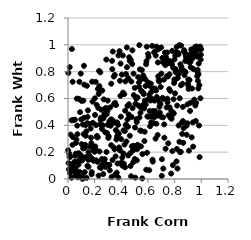
| Category | Series 0 |
|---|---|
| 0.8048160379679911 | 0.921 |
| 0.6412530690746505 | 0.416 |
| 0.036848699491668656 | 0.312 |
| 0.8508803725687043 | 0.835 |
| 0.6913978955041147 | 0.734 |
| 0.3902861109157759 | 0.213 |
| 0.5729293044220957 | 0.283 |
| 0.8110375856228726 | 0.946 |
| 0.24806886873163023 | 0.083 |
| 0.5027506385205199 | 0.384 |
| 0.44573678088368307 | 0.545 |
| 0.3434325248215889 | 0.764 |
| 0.561053336274124 | 0.55 |
| 0.24146370101987005 | 0.406 |
| 0.7851093031259042 | 0.482 |
| 0.20997103220456537 | 0.402 |
| 0.4303696479341876 | 0.727 |
| 0.10259249432398762 | 0.26 |
| 0.7798508613737885 | 0.853 |
| 0.24624403608130385 | 0.456 |
| 0.1730998822928173 | 0.308 |
| 0.8730987772841702 | 0.774 |
| 0.4771677226068377 | 0.462 |
| 0.19122029559249532 | 0.235 |
| 0.6785153978333146 | 0.967 |
| 0.03936746894879441 | 0.44 |
| 0.3206762801182168 | 0.443 |
| 0.38258311964538483 | 0.235 |
| 0.3844784113742594 | 0.225 |
| 0.3681660735472492 | 0.422 |
| 0.9689709140385898 | 0.766 |
| 0.6462743098852863 | 0.943 |
| 0.3099631757098164 | 0.105 |
| 0.8287489505397968 | 0.929 |
| 0.6857148374560557 | 0.538 |
| 0.4087598701721895 | 0.099 |
| 0.8693786946081973 | 0.95 |
| 0.8402111569531753 | 0.201 |
| 0.19983808856500268 | 0.203 |
| 0.806252504612378 | 0.819 |
| 0.29783745806520745 | 0.584 |
| 0.5157899796305667 | 0.425 |
| 0.8810528820988379 | 0.796 |
| 0.1490733598868999 | 0.511 |
| 0.4493409079521291 | 0.389 |
| 0.3490803277755809 | 0.222 |
| 0.8484357229467564 | 0.994 |
| 0.5293458375933919 | 0.547 |
| 0.4749559854918523 | 0.727 |
| 0.9367280181722548 | 0.422 |
| 0.6038354053874117 | 0.911 |
| 0.21098582234768798 | 0.214 |
| 0.12069687325942724 | 0.457 |
| 0.23005677510613035 | 0.634 |
| 0.020099144285102177 | 0.331 |
| 0.053496653326204194 | 0.174 |
| 0.14721049749832843 | 0.463 |
| 0.6044248210849298 | 0.465 |
| 0.9335570871204969 | 0.915 |
| 0.3604468680700396 | 0.551 |
| 0.643231094605576 | 0.478 |
| 0.9166533555953422 | 0.871 |
| 0.18891535484765548 | 0.228 |
| 0.37750553958991206 | 0.011 |
| 0.06481725295512407 | 0.051 |
| 0.49156706209330986 | 0.786 |
| 0.7650278276645177 | 0.876 |
| 0.7452519194500642 | 0.599 |
| 0.7916464292578508 | 0.594 |
| 0.4068009759231473 | 0.159 |
| 0.710834982930877 | 0.871 |
| 0.3133821718840352 | 0.064 |
| 0.7490497289972962 | 0.765 |
| 0.7035959168923077 | 0.023 |
| 0.3720860219728402 | 0.347 |
| 0.32833079129278914 | 0.443 |
| 0.6681677695936914 | 0.472 |
| 0.8272894318442069 | 0.779 |
| 0.04891064579619808 | 0.13 |
| 0.16629359704728555 | 0.242 |
| 0.023419354639812224 | 0.109 |
| 0.7985722187898523 | 0.891 |
| 0.16991982198271896 | 0.376 |
| 0.15444429967702467 | 0.2 |
| 0.18132061599412014 | 0.725 |
| 0.1702111666286856 | 0.151 |
| 0.9632057759010246 | 0.95 |
| 0.19315112764321993 | 0.135 |
| 0.31952743968310005 | 0.397 |
| 0.5693081703095949 | 0.538 |
| 0.004251761930587647 | 0.119 |
| 0.7430421501633343 | 0.942 |
| 0.697427239802067 | 0.464 |
| 0.9724679511926295 | 0.813 |
| 0.2173645918353844 | 0.321 |
| 0.9247368946319299 | 0.966 |
| 0.3632946576171775 | 0.295 |
| 0.5954264067940941 | 0.466 |
| 0.46419356395634676 | 0.322 |
| 0.6228622303132113 | 0.464 |
| 0.057300796040171006 | 0.084 |
| 0.4566102081277897 | 0.557 |
| 0.10893398358415206 | 0.001 |
| 0.6988001847450622 | 0.98 |
| 0.5646004305925687 | 0.772 |
| 0.33209803322518666 | 0.819 |
| 0.8081089625540443 | 0.796 |
| 0.596931256951981 | 0.592 |
| 0.3476574740772269 | 0.421 |
| 0.1397871017129596 | 0.009 |
| 0.45891351403084435 | 0.908 |
| 0.7169305897725119 | 0.597 |
| 0.9788435390067388 | 0.78 |
| 0.5787156323363809 | 0.745 |
| 0.7810713402161075 | 0.955 |
| 0.18611837737125309 | 0.419 |
| 0.05574871979741117 | 0.029 |
| 0.6547178969240556 | 0.506 |
| 0.17496583944255623 | 0.267 |
| 0.058492048325131656 | 0.189 |
| 0.2678159602451641 | 0.593 |
| 0.9384272792149398 | 0.241 |
| 0.1375155422211428 | 0.355 |
| 0.5160043820291768 | 0.139 |
| 0.695459926332687 | 0.686 |
| 0.8390021300136582 | 0.798 |
| 0.5818468911274911 | 0.693 |
| 0.9431416118818199 | 0.937 |
| 0.3654362141563176 | 0.047 |
| 0.35707544375562 | 0.169 |
| 0.7148270507419545 | 0.078 |
| 0.626209773768254 | 0.65 |
| 0.13431791821315836 | 0.164 |
| 0.9470443444692167 | 0.592 |
| 0.5500117425196831 | 0.359 |
| 0.9153122706672439 | 0.507 |
| 0.3588409693787901 | 0.364 |
| 0.5316174513720017 | 0.719 |
| 0.6642284447830702 | 0.987 |
| 0.7004161813679188 | 0.786 |
| 0.6769812162106348 | 0.765 |
| 0.3511859927170877 | 0.776 |
| 0.5750788586440214 | 0.352 |
| 0.8186558311569169 | 0.548 |
| 0.5678505033831696 | 0.633 |
| 0.2934922295686538 | 0.342 |
| 0.6314525070198469 | 0.992 |
| 0.28744572002241525 | 0.89 |
| 0.07585643305672715 | 0.119 |
| 0.32721904516621003 | 0.015 |
| 0.2792917243822691 | 0.348 |
| 0.1784138644780996 | 0.052 |
| 0.03143687584005224 | 0.104 |
| 0.576562385706362 | 0.583 |
| 0.37175541279924923 | 0.116 |
| 0.46128121574113173 | 0.471 |
| 0.8016925349532842 | 0.737 |
| 0.0025459312360142203 | 0.791 |
| 0.7255467778042767 | 0.872 |
| 0.8432535680032459 | 0.855 |
| 0.011003315112321476 | 0.166 |
| 0.7592884501775933 | 0.67 |
| 0.5193021105814963 | 0.224 |
| 0.7622489972222245 | 0.534 |
| 0.20782627532021755 | 0.724 |
| 0.07356854222332326 | 0.012 |
| 0.4187776700320601 | 0.114 |
| 0.9803273252812976 | 0.86 |
| 0.12572369945368816 | 0.052 |
| 0.9962262809924376 | 0.926 |
| 0.955091528708835 | 0.548 |
| 0.6069447748188267 | 0.597 |
| 0.5394631853148955 | 0.818 |
| 0.22332432873438213 | 0.311 |
| 0.8957698591122799 | 0.415 |
| 0.7891461199333766 | 0.828 |
| 0.0996434141433899 | 0.444 |
| 0.41515034023000635 | 0.191 |
| 0.5905139478385715 | 0.986 |
| 0.41675038389553093 | 0.363 |
| 0.773657236450272 | 0.041 |
| 0.44212130910114417 | 0.834 |
| 0.02567283399442044 | 0.009 |
| 0.7357055891118258 | 0.899 |
| 0.712584043953238 | 0.459 |
| 0.3528253194551974 | 0.568 |
| 0.12858840296570873 | 0.255 |
| 0.3243486007848635 | 0.71 |
| 0.7292748688178311 | 0.849 |
| 0.6128191903510176 | 0.507 |
| 0.2652916094593917 | 0.451 |
| 0.17699813911388584 | 0.035 |
| 0.18206875130349506 | 0.149 |
| 0.03367878854220705 | 0.254 |
| 0.20457784158936188 | 0.243 |
| 0.35437475748089486 | 0.033 |
| 0.30188381878609855 | 0.104 |
| 0.7832535737038714 | 0.208 |
| 0.8378237581727616 | 0.602 |
| 0.8878453451417957 | 0.903 |
| 0.7227709617211416 | 0.308 |
| 0.27119482135427997 | 0.135 |
| 0.6741525502740761 | 0.869 |
| 0.2846269977825291 | 0.529 |
| 0.04248283480025894 | 0.44 |
| 0.10569333759641586 | 0.138 |
| 0.3149154482639664 | 0.428 |
| 0.10613027869866468 | 0.029 |
| 0.6008738392626107 | 0.932 |
| 0.5583455519500062 | 0.186 |
| 0.019526181794592687 | 0.08 |
| 0.7319281915286389 | 0.226 |
| 0.3863287146455442 | 0.953 |
| 0.2502086209785679 | 0.517 |
| 0.5118125078379672 | 0.599 |
| 0.9359485178314961 | 0.907 |
| 0.02626952171052562 | 0.437 |
| 0.6189620236211834 | 0.585 |
| 0.32380969739468063 | 0.252 |
| 0.23548311139305195 | 0.692 |
| 0.08802271889430067 | 0.021 |
| 0.3303849235876428 | 0.88 |
| 0.5362201288249856 | 0.458 |
| 0.39445658199639444 | 0.86 |
| 0.8211185322290097 | 0.078 |
| 0.884926725820854 | 0.912 |
| 0.554770012315542 | 0.746 |
| 0.5047507612138872 | 0.01 |
| 0.8138530986290082 | 0.131 |
| 0.4936511180437289 | 0.626 |
| 0.5257141636804944 | 0.243 |
| 0.07729899798224192 | 0.136 |
| 0.22195285289826638 | 0.128 |
| 0.6611505145517063 | 0.66 |
| 0.48879040461983303 | 0.125 |
| 0.2574499699053005 | 0.659 |
| 0.15372361772268164 | 0.091 |
| 0.12216927066635556 | 0.703 |
| 0.9569947193062386 | 0.918 |
| 0.80283383021104 | 0.638 |
| 0.2272596090131578 | 0.53 |
| 0.7329941121807774 | 0.911 |
| 0.05169937658675466 | 0.443 |
| 0.2389293736291419 | 0.087 |
| 0.19409776975635853 | 0.141 |
| 0.1114741315942896 | 0.406 |
| 0.09720404005544354 | 0.176 |
| 0.40507617500263177 | 0.107 |
| 0.012877030387724989 | 0.833 |
| 0.006186548690355044 | 0.072 |
| 0.6480284451013497 | 0.584 |
| 0.49990928045378746 | 0.149 |
| 0.08582776277927397 | 0.724 |
| 0.3066266022679924 | 0.102 |
| 0.9495267015247435 | 0.568 |
| 0.6338795058866682 | 0.144 |
| 0.09564642717308515 | 0.786 |
| 0.845718230965016 | 0.202 |
| 0.8798297608187026 | 0.88 |
| 0.6104640549995154 | 0.629 |
| 0.9773982121956997 | 0.675 |
| 0.9023455612930342 | 0.742 |
| 0.2024244632717279 | 0.477 |
| 0.33630020221003804 | 0.95 |
| 0.09334830717075344 | 0.163 |
| 0.436367324262943 | 0.4 |
| 0.4037290532755966 | 0.778 |
| 0.5858075881716347 | 0.856 |
| 0.5639277297016065 | 0.643 |
| 0.7377081769587723 | 0.86 |
| 0.5701948762098781 | 0.526 |
| 0.2982828558493133 | 0.403 |
| 0.06602702955017496 | 0.599 |
| 0.7767001165413997 | 0.449 |
| 0.8540516027454408 | 0.817 |
| 0.2885757618384845 | 0.201 |
| 0.5536851859976736 | 0.813 |
| 0.8714939164513476 | 0.96 |
| 0.8169132408031525 | 0.225 |
| 0.9604627735899908 | 0.568 |
| 0.13353072803829116 | 0.321 |
| 0.16116040444494234 | 0.146 |
| 0.645677240170929 | 0.459 |
| 0.8923328184327886 | 0.899 |
| 0.2445044592955393 | 0.44 |
| 0.49742016741247386 | 0.225 |
| 0.5212950531172788 | 0.608 |
| 0.46291493973622916 | 0.881 |
| 0.22435324083276867 | 0.671 |
| 0.11328195037163839 | 0.228 |
| 0.04542772198222292 | 0.072 |
| 0.14172102281630997 | 0.695 |
| 0.8233251014317677 | 0.753 |
| 0.38136331223588515 | 0.336 |
| 0.5447603854827491 | 0.533 |
| 0.44630200163421735 | 0.444 |
| 0.6152622673486504 | 0.393 |
| 0.06954432759656205 | 0.398 |
| 0.9538337138075925 | 0.984 |
| 0.07823886163864259 | 0.107 |
| 0.29567267988940527 | 0.507 |
| 0.6209758316676542 | 0.711 |
| 0.4711321878775796 | 0.886 |
| 0.46733872729850434 | 0.193 |
| 0.04623738387279152 | 0.061 |
| 0.9185754063880479 | 0.569 |
| 0.9111752724431398 | 0.738 |
| 0.9930836196339418 | 0.602 |
| 0.90451054648089 | 0.671 |
| 0.8899003543592757 | 0.398 |
| 0.693345514646579 | 0.558 |
| 0.5431662295309747 | 0.493 |
| 0.3896380970998756 | 0.732 |
| 0.30515867955544 | 0.319 |
| 0.029177174765890736 | 0.969 |
| 0.03473832320113161 | 0.725 |
| 0.5886629924351962 | 0.878 |
| 0.835591764989214 | 0.277 |
| 0.9950032082174447 | 0.89 |
| 0.2588373860797932 | 0.108 |
| 0.060135003793550426 | 0.269 |
| 0.7463788877903434 | 0.572 |
| 0.592633580028227 | 0.196 |
| 0.3162496985230245 | 0.534 |
| 0.20126166044251567 | 0.602 |
| 0.6241956494478965 | 0.422 |
| 0.08679455388774969 | 0.053 |
| 0.9274336521782525 | 0.311 |
| 0.7091191694231516 | 0.605 |
| 0.6804002939747648 | 0.737 |
| 0.5352446029543049 | 0.997 |
| 0.982633620595707 | 0.399 |
| 0.0014173401793039727 | 0.214 |
| 0.41253459651920354 | 0.643 |
| 0.42771417932345396 | 0.087 |
| 0.3024526287686202 | 0.306 |
| 0.5869260479446795 | 0.069 |
| 0.9847453372522129 | 0.7 |
| 0.9502558711059987 | 0.942 |
| 0.48625964030769175 | 0.212 |
| 0.40118843626863987 | 0.123 |
| 0.26075685522955766 | 0.4 |
| 0.19626981598331356 | 0.209 |
| 0.8961353264265077 | 0.556 |
| 0.008951014118490511 | 0.19 |
| 0.8670603424126889 | 0.378 |
| 0.9716295100431026 | 0.797 |
| 0.4686047192664362 | 0.097 |
| 0.7047381538014715 | 0.148 |
| 0.12635470994151074 | 0.231 |
| 0.31008074148234 | 0.428 |
| 0.374935448754331 | 0.404 |
| 0.3447304075864913 | 0.558 |
| 0.27539367529782316 | 0.148 |
| 0.9126504838109599 | 0.915 |
| 0.7666258164017056 | 0.657 |
| 0.28295579248363056 | 0.111 |
| 0.508342251192858 | 0.235 |
| 0.39321054214407003 | 0.62 |
| 0.26812384855005045 | 0.462 |
| 0.48136507836854203 | 0.857 |
| 0.8472000293063932 | 0.699 |
| 0.6095097475139214 | 0.065 |
| 0.1566214265517475 | 0.149 |
| 0.7397729982779764 | 0.534 |
| 0.8538222985448833 | 0.42 |
| 0.28131536653435685 | 0.091 |
| 0.5410113143359803 | 0.361 |
| 0.16263601469403038 | 0.17 |
| 0.6719616360124111 | 0.595 |
| 0.5008025319284766 | 0.679 |
| 0.9450038752325354 | 0.917 |
| 0.7218275351179362 | 0.407 |
| 0.36753989602754356 | 0.316 |
| 0.9644264661205062 | 0.987 |
| 0.24244693615111684 | 0.795 |
| 0.4552812150957252 | 0.481 |
| 0.7934859104057508 | 0.49 |
| 0.861456895910077 | 0.537 |
| 0.23647019126137492 | 0.205 |
| 0.7708872536418231 | 0.872 |
| 0.4523679563511088 | 0.751 |
| 0.435180899166777 | 0.782 |
| 0.8562217136463667 | 0.336 |
| 0.1841013702159052 | 0.577 |
| 0.4219888138147045 | 0.632 |
| 0.9236828227154171 | 0.939 |
| 0.11961414322667153 | 0.844 |
| 0.7569432886640876 | 0.88 |
| 0.9912602430137946 | 0.987 |
| 0.8759689700202944 | 0.802 |
| 0.23329685106903708 | 0.806 |
| 0.3784666447933918 | 0.921 |
| 0.76153144905519 | 0.78 |
| 0.6887186105020155 | 0.495 |
| 0.7956687180878755 | 0.716 |
| 0.719378736267653 | 0.74 |
| 0.041499562839395265 | 0.082 |
| 0.09057465893928303 | 0.498 |
| 0.7746516469322732 | 0.508 |
| 0.7553424669311714 | 0.863 |
| 0.9665617627023164 | 0.912 |
| 0.3987209460061791 | 0.297 |
| 0.9742837852943418 | 0.732 |
| 0.4844253448565549 | 0.528 |
| 0.7269521220533531 | 0.942 |
| 0.9069609003898131 | 0.211 |
| 0.6872224141608977 | 0.568 |
| 0.5829618563947645 | 0.555 |
| 0.4335052004827897 | 0.406 |
| 0.13169487578507857 | 0.402 |
| 0.6566089395323323 | 0.301 |
| 0.2639255128353661 | 0.037 |
| 0.2765287404126788 | 0.524 |
| 0.6390117044772514 | 0.672 |
| 0.9301674912684056 | 0.674 |
| 0.5992929948883348 | 0.721 |
| 0.8153905685128157 | 0.984 |
| 0.9205150469132967 | 0.833 |
| 0.4259065800518511 | 0.357 |
| 0.8583198121879995 | 0.71 |
| 0.016319693774990665 | 0.165 |
| 0.513187397122194 | 0.445 |
| 0.6663663677588026 | 0.611 |
| 0.11756236196857932 | 0.334 |
| 0.4729816625497727 | 0.021 |
| 0.06354872401932923 | 0.293 |
| 0.7516971592958311 | 0.266 |
| 0.7074827867167729 | 0.902 |
| 0.8300571113545581 | 0.399 |
| 0.4414608648082849 | 0.98 |
| 0.3342864665711034 | 0.142 |
| 0.9583146697958732 | 0.432 |
| 0.3386570557855668 | 0.432 |
| 0.9411610354700035 | 0.819 |
| 0.5262022897289605 | 0.759 |
| 0.7867224411858997 | 0.103 |
| 0.4288211925171365 | 0.509 |
| 0.4382168163578531 | 0.28 |
| 0.5229539007081078 | 0.255 |
| 0.833956175453485 | 0.998 |
| 0.6356167118776629 | 0.129 |
| 0.9019803704293399 | 0.696 |
| 0.49475358526100255 | 0.248 |
| 0.14583691243497582 | 0.099 |
| 0.8620066643203624 | 0.431 |
| 0.7974026840709623 | 0.742 |
| 0.7699843633873352 | 0.456 |
| 0.3411244877127755 | 0.237 |
| 0.08046556629204787 | 0.192 |
| 0.15036181048545097 | 0.144 |
| 0.5062537922012279 | 0.561 |
| 0.014703220502637145 | 0.045 |
| 0.6725819227668881 | 0.328 |
| 0.989411404189051 | 0.971 |
| 0.21224475868005416 | 0.139 |
| 0.8993334392982846 | 0.713 |
| 0.39648743595194247 | 0.465 |
| 0.4236894743046 | 0.257 |
| 0.7534884722674006 | 0.474 |
| 0.533160720813824 | 0.687 |
| 0.1011751668344194 | 0.582 |
| 0.27282527164016507 | 0.483 |
| 0.2900080108782295 | 0.483 |
| 0.48282163197100664 | 0.959 |
| 0.08239851724877918 | 0.597 |
| 0.9985994271823669 | 0.967 |
| 0.629030960506534 | 0.598 |
| 0.6521424917634908 | 0.674 |
| 0.2543821224929723 | 0.373 |
| 0.2184824302737793 | 0.311 |
| 0.9094795172371621 | 0.869 |
| 0.41083057306726245 | 0.921 |
| 0.9284357248829761 | 0.893 |
| 0.6626427791664942 | 0.412 |
| 0.6581896940297888 | 0.92 |
| 0.25399014575965473 | 0.148 |
| 0.5490534452314146 | 0.658 |
| 0.47865498994771744 | 0.244 |
| 0.7411382445262601 | 0.765 |
| 0.0705422653985541 | 0.334 |
| 0.14342377212769908 | 0.416 |
| 0.1644417291298606 | 0.169 |
| 0.11558285317234294 | 0.584 |
| 0.6179660438168715 | 0.691 |
| 0.5466750071893155 | 0.243 |
| 0.8832712474533523 | 0.926 |
| 0.6503352628211341 | 0.949 |
| 0.6378421120396448 | 0.507 |
| 0.556653714259773 | 0.004 |
| 0.864092065002325 | 0.27 |
| 0.4513612883704159 | 0.175 |
| 0.8765018873034283 | 0.941 |
| 0.21545099588051694 | 0.552 |
| 0.22934550306465137 | 0.025 |
| 0.9868953963175638 | 0.163 |
| 0.6834623554245248 | 0.727 |
| 0.8904267720241162 | 0.33 |
| 0.8255797019972418 | 0.94 |
| 0.1595955461793569 | 0.41 |